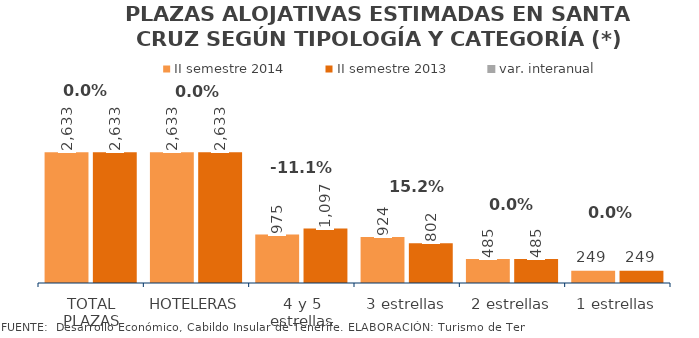
| Category | II semestre 2014 | II semestre 2013 |
|---|---|---|
| TOTAL PLAZAS | 2633 | 2633 |
| HOTELERAS | 2633 | 2633 |
| 4 y 5 estrellas | 975 | 1097 |
| 3 estrellas | 924 | 802 |
| 2 estrellas | 485 | 485 |
| 1 estrellas | 249 | 249 |